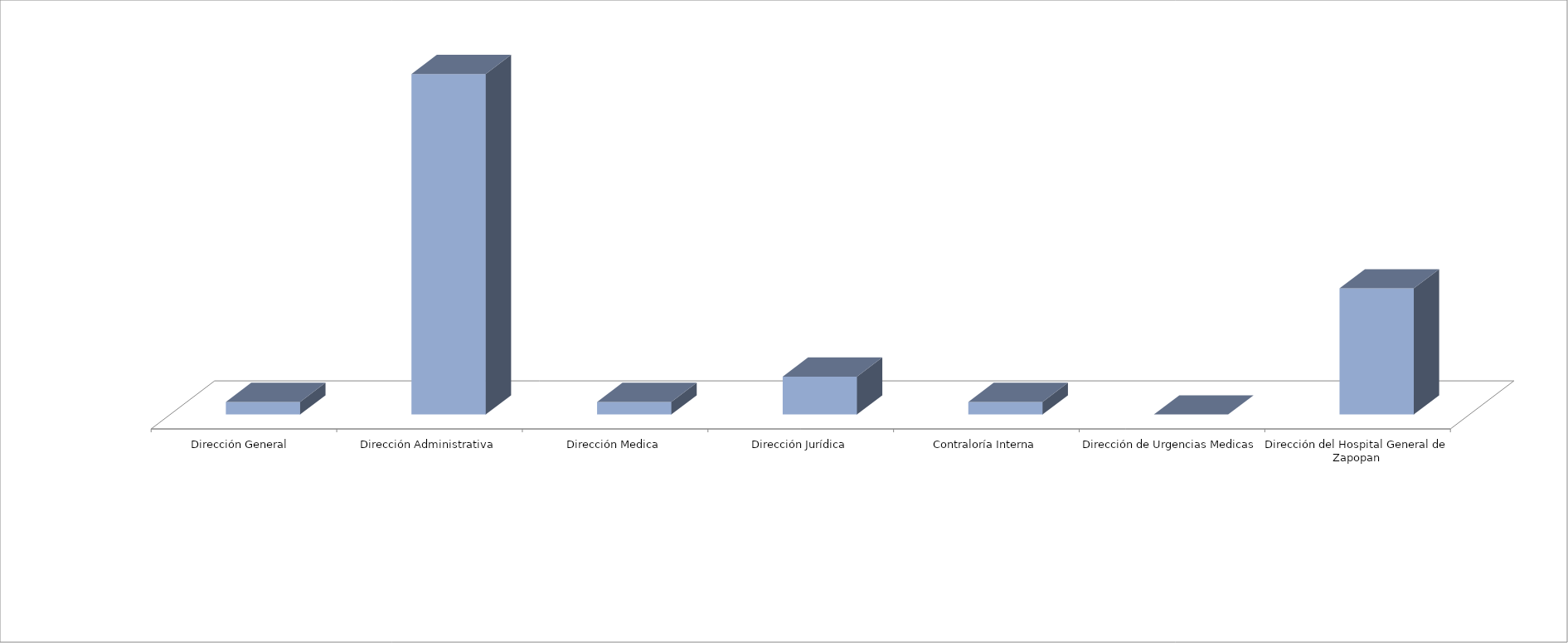
| Category | Series 0 | Series 1 |
|---|---|---|
| Dirección General  |  | 1 |
| Dirección Administrativa |  | 27 |
| Dirección Medica |  | 1 |
| Dirección Jurídica |  | 3 |
| Contraloría Interna |  | 1 |
| Dirección de Urgencias Medicas |  | 0 |
| Dirección del Hospital General de Zapopan |  | 10 |